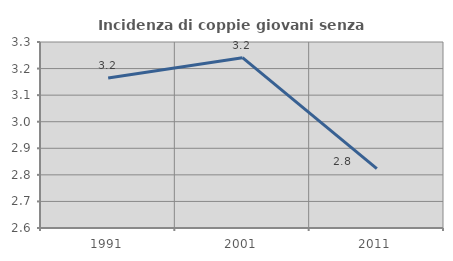
| Category | Incidenza di coppie giovani senza figli |
|---|---|
| 1991.0 | 3.164 |
| 2001.0 | 3.241 |
| 2011.0 | 2.823 |